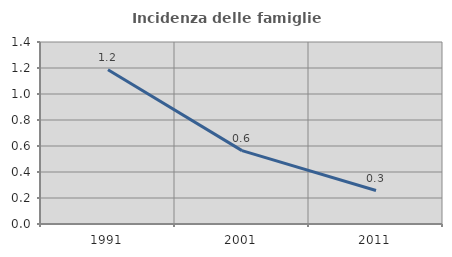
| Category | Incidenza delle famiglie numerose |
|---|---|
| 1991.0 | 1.186 |
| 2001.0 | 0.565 |
| 2011.0 | 0.257 |